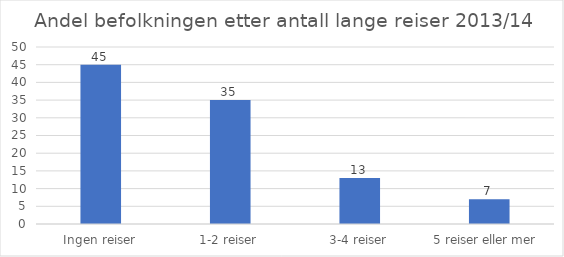
| Category | Andel av befolk-ningen (%) |
|---|---|
| Ingen reiser | 45 |
| 1-2 reiser | 35 |
| 3-4 reiser | 13 |
| 5 reiser eller mer  | 7 |